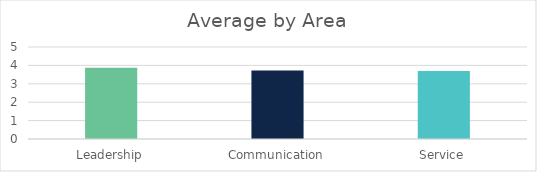
| Category | Series 0 |
|---|---|
| Leadership | 3.87 |
| Communication | 3.72 |
| Service | 3.7 |